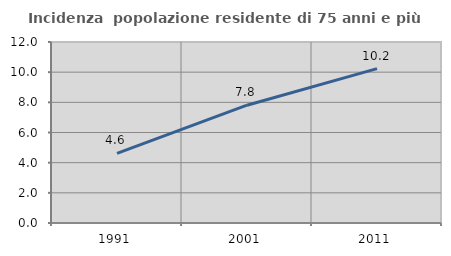
| Category | Incidenza  popolazione residente di 75 anni e più |
|---|---|
| 1991.0 | 4.615 |
| 2001.0 | 7.811 |
| 2011.0 | 10.237 |